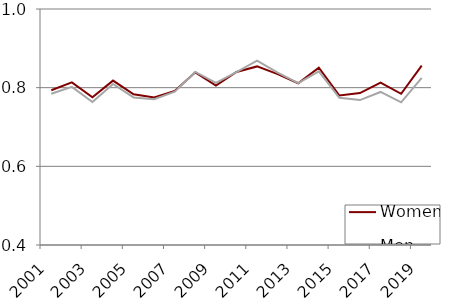
| Category | Women | Men |
|---|---|---|
| 2001.0 | 0.794 | 0.784 |
| 2002.0 | 0.813 | 0.802 |
| 2003.0 | 0.775 | 0.763 |
| 2004.0 | 0.818 | 0.809 |
| 2005.0 | 0.783 | 0.775 |
| 2006.0 | 0.775 | 0.771 |
| 2007.0 | 0.792 | 0.79 |
| 2008.0 | 0.839 | 0.84 |
| 2009.0 | 0.805 | 0.812 |
| 2010.0 | 0.84 | 0.84 |
| 2011.0 | 0.854 | 0.869 |
| 2012.0 | 0.834 | 0.838 |
| 2013.0 | 0.811 | 0.812 |
| 2014.0 | 0.851 | 0.842 |
| 2015.0 | 0.78 | 0.774 |
| 2016.0 | 0.786 | 0.768 |
| 2017.0 | 0.813 | 0.789 |
| 2018.0 | 0.784 | 0.763 |
| 2019.0 | 0.856 | 0.825 |